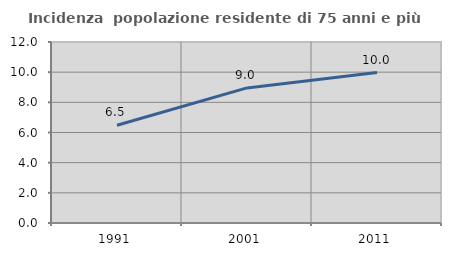
| Category | Incidenza  popolazione residente di 75 anni e più |
|---|---|
| 1991.0 | 6.481 |
| 2001.0 | 8.955 |
| 2011.0 | 9.975 |